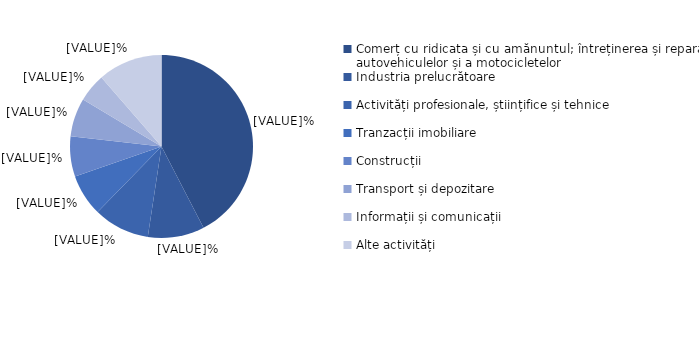
| Category | Series 0 |
|---|---|
| Comerț cu ridicata și cu amănuntul; întreținerea și repararea autovehiculelor și a motocicletelor | 42.4 |
| Industria prelucrătoare | 10 |
| Activități profesionale, științifice și tehnice | 9.9 |
| Tranzacții imobiliare | 7.4 |
| Construcții | 7.1 |
| Transport și depozitare | 6.8 |
| Informații și comunicații | 5 |
| Alte activități | 11.4 |